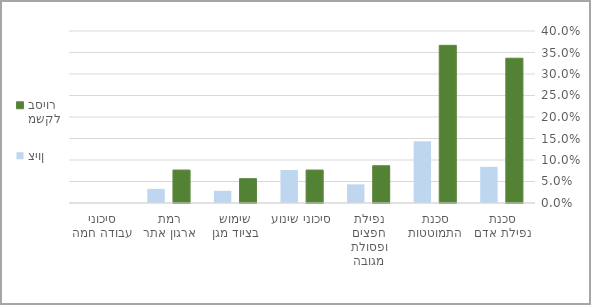
| Category | משקל בסיור | ציון |
|---|---|---|
| סכנת נפילת אדם | 0.337 | 0.084 |
| סכנת התמוטטות | 0.367 | 0.143 |
| נפילת חפצים ופסולת מגובה | 0.087 | 0.043 |
| סיכוני שינוע | 0.077 | 0.077 |
| שימוש בציוד מגן | 0.057 | 0.028 |
| רמת ארגון אתר | 0.077 | 0.033 |
| סיכוני עבודה חמה | 0 | 0 |